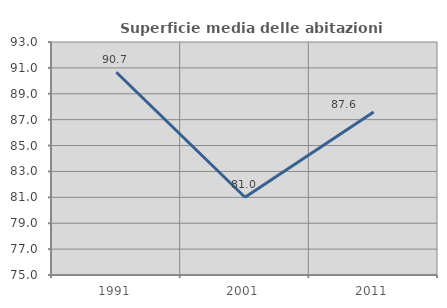
| Category | Superficie media delle abitazioni occupate |
|---|---|
| 1991.0 | 90.662 |
| 2001.0 | 81.008 |
| 2011.0 | 87.589 |